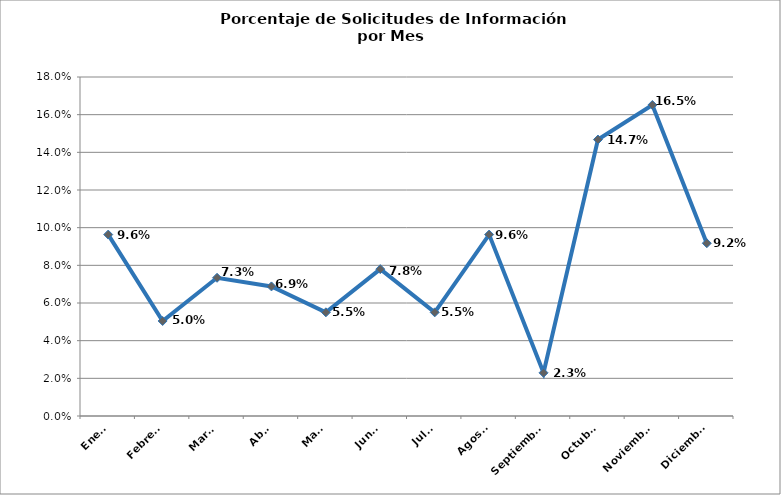
| Category | Series 0 |
|---|---|
| Enero | 0.096 |
| Febrero | 0.05 |
| Marzo | 0.073 |
| Abril | 0.069 |
| Mayo | 0.055 |
| Junio | 0.078 |
| Julio | 0.055 |
| Agosto | 0.096 |
| Septiembre | 0.023 |
| Octubre | 0.147 |
| Noviembre | 0.165 |
| Diciembre | 0.092 |